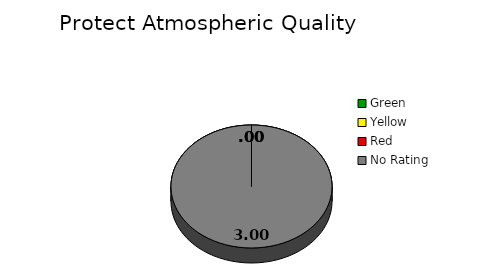
| Category | Counts |
|---|---|
| Green | 0 |
| Yellow | 0 |
| Red | 0 |
| No Rating | 3 |